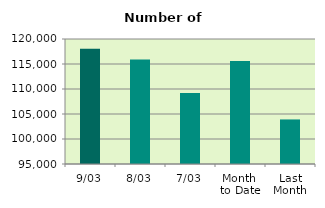
| Category | Series 0 |
|---|---|
| 9/03 | 118046 |
| 8/03 | 115894 |
| 7/03 | 109198 |
| Month 
to Date | 115609.429 |
| Last
Month | 103910.7 |